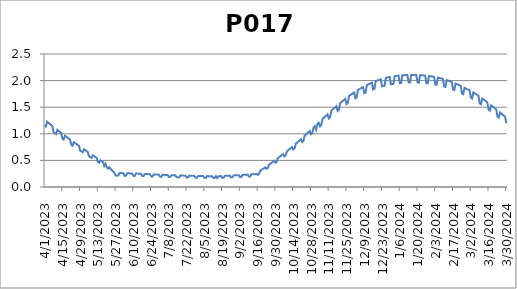
| Category | P017 |
|---|---|
| 4/1/23 | 1.159 |
| 4/2/23 | 1.139 |
| 4/3/23 | 1.226 |
| 4/4/23 | 1.207 |
| 4/5/23 | 1.187 |
| 4/6/23 | 1.168 |
| 4/7/23 | 1.149 |
| 4/8/23 | 1.031 |
| 4/9/23 | 1.013 |
| 4/10/23 | 0.995 |
| 4/11/23 | 1.075 |
| 4/12/23 | 1.056 |
| 4/13/23 | 1.037 |
| 4/14/23 | 1.019 |
| 4/15/23 | 0.909 |
| 4/16/23 | 0.891 |
| 4/17/23 | 0.964 |
| 4/18/23 | 0.947 |
| 4/19/23 | 0.929 |
| 4/20/23 | 0.911 |
| 4/21/23 | 0.894 |
| 4/22/23 | 0.794 |
| 4/23/23 | 0.778 |
| 4/24/23 | 0.842 |
| 4/25/23 | 0.825 |
| 4/26/23 | 0.808 |
| 4/27/23 | 0.792 |
| 4/28/23 | 0.775 |
| 4/29/23 | 0.684 |
| 4/30/23 | 0.669 |
| 5/1/23 | 0.652 |
| 5/2/23 | 0.709 |
| 5/3/23 | 0.693 |
| 5/4/23 | 0.677 |
| 5/5/23 | 0.66 |
| 5/6/23 | 0.577 |
| 5/7/23 | 0.561 |
| 5/8/23 | 0.546 |
| 5/9/23 | 0.596 |
| 5/10/23 | 0.579 |
| 5/11/23 | 0.563 |
| 5/12/23 | 0.548 |
| 5/13/23 | 0.472 |
| 5/14/23 | 0.457 |
| 5/15/23 | 0.5 |
| 5/16/23 | 0.484 |
| 5/17/23 | 0.468 |
| 5/18/23 | 0.397 |
| 5/19/23 | 0.436 |
| 5/20/23 | 0.367 |
| 5/21/23 | 0.346 |
| 5/22/23 | 0.37 |
| 5/23/23 | 0.343 |
| 5/24/23 | 0.316 |
| 5/25/23 | 0.29 |
| 5/26/23 | 0.269 |
| 5/27/23 | 0.215 |
| 5/28/23 | 0.214 |
| 5/29/23 | 0.214 |
| 5/30/23 | 0.263 |
| 5/31/23 | 0.262 |
| 6/1/23 | 0.261 |
| 6/2/23 | 0.26 |
| 6/3/23 | 0.212 |
| 6/4/23 | 0.211 |
| 6/5/23 | 0.258 |
| 6/6/23 | 0.257 |
| 6/7/23 | 0.256 |
| 6/8/23 | 0.255 |
| 6/9/23 | 0.255 |
| 6/10/23 | 0.209 |
| 6/11/23 | 0.209 |
| 6/12/23 | 0.252 |
| 6/13/23 | 0.252 |
| 6/14/23 | 0.251 |
| 6/15/23 | 0.25 |
| 6/16/23 | 0.249 |
| 6/17/23 | 0.206 |
| 6/18/23 | 0.205 |
| 6/19/23 | 0.245 |
| 6/20/23 | 0.244 |
| 6/21/23 | 0.243 |
| 6/22/23 | 0.242 |
| 6/23/23 | 0.24 |
| 6/24/23 | 0.199 |
| 6/25/23 | 0.198 |
| 6/26/23 | 0.237 |
| 6/27/23 | 0.236 |
| 6/28/23 | 0.235 |
| 6/29/23 | 0.233 |
| 6/30/23 | 0.232 |
| 7/1/23 | 0.193 |
| 7/2/23 | 0.193 |
| 7/3/23 | 0.229 |
| 7/4/23 | 0.228 |
| 7/5/23 | 0.227 |
| 7/6/23 | 0.226 |
| 7/7/23 | 0.225 |
| 7/8/23 | 0.188 |
| 7/9/23 | 0.187 |
| 7/10/23 | 0.222 |
| 7/11/23 | 0.221 |
| 7/12/23 | 0.22 |
| 7/13/23 | 0.219 |
| 7/14/23 | 0.183 |
| 7/15/23 | 0.182 |
| 7/16/23 | 0.182 |
| 7/17/23 | 0.216 |
| 7/18/23 | 0.215 |
| 7/19/23 | 0.214 |
| 7/20/23 | 0.214 |
| 7/21/23 | 0.213 |
| 7/22/23 | 0.179 |
| 7/23/23 | 0.178 |
| 7/24/23 | 0.211 |
| 7/25/23 | 0.211 |
| 7/26/23 | 0.21 |
| 7/27/23 | 0.209 |
| 7/28/23 | 0.209 |
| 7/29/23 | 0.175 |
| 7/30/23 | 0.174 |
| 7/31/23 | 0.207 |
| 8/1/23 | 0.207 |
| 8/2/23 | 0.207 |
| 8/3/23 | 0.206 |
| 8/4/23 | 0.206 |
| 8/5/23 | 0.172 |
| 8/6/23 | 0.172 |
| 8/7/23 | 0.204 |
| 8/8/23 | 0.204 |
| 8/9/23 | 0.204 |
| 8/10/23 | 0.203 |
| 8/11/23 | 0.203 |
| 8/12/23 | 0.169 |
| 8/13/23 | 0.169 |
| 8/14/23 | 0.202 |
| 8/15/23 | 0.168 |
| 8/16/23 | 0.203 |
| 8/17/23 | 0.204 |
| 8/18/23 | 0.205 |
| 8/19/23 | 0.173 |
| 8/20/23 | 0.174 |
| 8/21/23 | 0.209 |
| 8/22/23 | 0.21 |
| 8/23/23 | 0.212 |
| 8/24/23 | 0.213 |
| 8/25/23 | 0.214 |
| 8/26/23 | 0.181 |
| 8/27/23 | 0.182 |
| 8/28/23 | 0.218 |
| 8/29/23 | 0.22 |
| 8/30/23 | 0.221 |
| 8/31/23 | 0.222 |
| 9/1/23 | 0.223 |
| 9/2/23 | 0.188 |
| 9/3/23 | 0.189 |
| 9/4/23 | 0.227 |
| 9/5/23 | 0.228 |
| 9/6/23 | 0.23 |
| 9/7/23 | 0.231 |
| 9/8/23 | 0.233 |
| 9/9/23 | 0.197 |
| 9/10/23 | 0.198 |
| 9/11/23 | 0.237 |
| 9/12/23 | 0.239 |
| 9/13/23 | 0.24 |
| 9/14/23 | 0.242 |
| 9/15/23 | 0.246 |
| 9/16/23 | 0.228 |
| 9/17/23 | 0.246 |
| 9/18/23 | 0.305 |
| 9/19/23 | 0.325 |
| 9/20/23 | 0.338 |
| 9/21/23 | 0.352 |
| 9/22/23 | 0.368 |
| 9/23/23 | 0.342 |
| 9/24/23 | 0.359 |
| 9/25/23 | 0.421 |
| 9/26/23 | 0.44 |
| 9/27/23 | 0.456 |
| 9/28/23 | 0.475 |
| 9/29/23 | 0.492 |
| 9/30/23 | 0.458 |
| 10/1/23 | 0.476 |
| 10/2/23 | 0.545 |
| 10/3/23 | 0.563 |
| 10/4/23 | 0.58 |
| 10/5/23 | 0.598 |
| 10/6/23 | 0.617 |
| 10/7/23 | 0.576 |
| 10/8/23 | 0.593 |
| 10/9/23 | 0.671 |
| 10/10/23 | 0.689 |
| 10/11/23 | 0.71 |
| 10/12/23 | 0.729 |
| 10/13/23 | 0.75 |
| 10/14/23 | 0.706 |
| 10/15/23 | 0.725 |
| 10/16/23 | 0.813 |
| 10/17/23 | 0.834 |
| 10/18/23 | 0.856 |
| 10/19/23 | 0.877 |
| 10/20/23 | 0.898 |
| 10/21/23 | 0.845 |
| 10/22/23 | 0.866 |
| 10/23/23 | 0.964 |
| 10/24/23 | 0.986 |
| 10/25/23 | 1.008 |
| 10/26/23 | 1.029 |
| 10/27/23 | 1.052 |
| 10/28/23 | 0.991 |
| 10/29/23 | 1.013 |
| 10/30/23 | 1.119 |
| 10/31/23 | 1.142 |
| 11/1/23 | 1.077 |
| 11/2/23 | 1.187 |
| 11/3/23 | 1.21 |
| 11/4/23 | 1.14 |
| 11/5/23 | 1.163 |
| 11/6/23 | 1.276 |
| 11/7/23 | 1.299 |
| 11/8/23 | 1.322 |
| 11/9/23 | 1.344 |
| 11/10/23 | 1.367 |
| 11/11/23 | 1.288 |
| 11/12/23 | 1.309 |
| 11/13/23 | 1.432 |
| 11/14/23 | 1.453 |
| 11/15/23 | 1.475 |
| 11/16/23 | 1.496 |
| 11/17/23 | 1.517 |
| 11/18/23 | 1.43 |
| 11/19/23 | 1.449 |
| 11/20/23 | 1.579 |
| 11/21/23 | 1.598 |
| 11/22/23 | 1.618 |
| 11/23/23 | 1.637 |
| 11/24/23 | 1.656 |
| 11/25/23 | 1.558 |
| 11/26/23 | 1.575 |
| 11/27/23 | 1.71 |
| 11/28/23 | 1.728 |
| 11/29/23 | 1.744 |
| 11/30/23 | 1.76 |
| 12/1/23 | 1.777 |
| 12/2/23 | 1.669 |
| 12/3/23 | 1.684 |
| 12/4/23 | 1.824 |
| 12/5/23 | 1.838 |
| 12/6/23 | 1.851 |
| 12/7/23 | 1.865 |
| 12/8/23 | 1.879 |
| 12/9/23 | 1.761 |
| 12/10/23 | 1.773 |
| 12/11/23 | 1.916 |
| 12/12/23 | 1.928 |
| 12/13/23 | 1.939 |
| 12/14/23 | 1.95 |
| 12/15/23 | 1.962 |
| 12/16/23 | 1.834 |
| 12/17/23 | 1.845 |
| 12/18/23 | 1.99 |
| 12/19/23 | 1.999 |
| 12/20/23 | 2.006 |
| 12/21/23 | 2.016 |
| 12/22/23 | 2.024 |
| 12/23/23 | 1.892 |
| 12/24/23 | 1.898 |
| 12/25/23 | 1.904 |
| 12/26/23 | 2.051 |
| 12/27/23 | 2.057 |
| 12/28/23 | 2.063 |
| 12/29/23 | 2.068 |
| 12/30/23 | 1.931 |
| 12/31/23 | 1.934 |
| 1/1/24 | 1.938 |
| 1/2/24 | 2.084 |
| 1/3/24 | 2.088 |
| 1/4/24 | 2.091 |
| 1/5/24 | 2.094 |
| 1/6/24 | 1.953 |
| 1/7/24 | 1.956 |
| 1/8/24 | 2.1 |
| 1/9/24 | 2.101 |
| 1/10/24 | 2.103 |
| 1/11/24 | 2.104 |
| 1/12/24 | 2.105 |
| 1/13/24 | 1.963 |
| 1/14/24 | 1.964 |
| 1/15/24 | 2.107 |
| 1/16/24 | 2.107 |
| 1/17/24 | 2.106 |
| 1/18/24 | 2.106 |
| 1/19/24 | 2.105 |
| 1/20/24 | 1.962 |
| 1/21/24 | 1.962 |
| 1/22/24 | 2.102 |
| 1/23/24 | 2.1 |
| 1/24/24 | 2.098 |
| 1/25/24 | 2.096 |
| 1/26/24 | 2.094 |
| 1/27/24 | 1.951 |
| 1/28/24 | 1.949 |
| 1/29/24 | 2.085 |
| 1/30/24 | 2.082 |
| 1/31/24 | 2.079 |
| 2/1/24 | 2.074 |
| 2/2/24 | 2.069 |
| 2/3/24 | 1.926 |
| 2/4/24 | 1.922 |
| 2/5/24 | 2.055 |
| 2/6/24 | 2.05 |
| 2/7/24 | 2.044 |
| 2/8/24 | 2.038 |
| 2/9/24 | 2.031 |
| 2/10/24 | 1.887 |
| 2/11/24 | 1.881 |
| 2/12/24 | 2.009 |
| 2/13/24 | 2.001 |
| 2/14/24 | 1.993 |
| 2/15/24 | 1.985 |
| 2/16/24 | 1.975 |
| 2/17/24 | 1.831 |
| 2/18/24 | 1.822 |
| 2/19/24 | 1.945 |
| 2/20/24 | 1.935 |
| 2/21/24 | 1.925 |
| 2/22/24 | 1.913 |
| 2/23/24 | 1.9 |
| 2/24/24 | 1.756 |
| 2/25/24 | 1.745 |
| 2/26/24 | 1.864 |
| 2/27/24 | 1.851 |
| 2/28/24 | 1.837 |
| 2/29/24 | 1.829 |
| 3/1/24 | 1.822 |
| 3/2/24 | 1.68 |
| 3/3/24 | 1.664 |
| 3/4/24 | 1.778 |
| 3/5/24 | 1.762 |
| 3/6/24 | 1.747 |
| 3/7/24 | 1.73 |
| 3/8/24 | 1.714 |
| 3/9/24 | 1.572 |
| 3/10/24 | 1.556 |
| 3/11/24 | 1.663 |
| 3/12/24 | 1.647 |
| 3/13/24 | 1.628 |
| 3/14/24 | 1.61 |
| 3/15/24 | 1.591 |
| 3/16/24 | 1.453 |
| 3/17/24 | 1.435 |
| 3/18/24 | 1.535 |
| 3/19/24 | 1.516 |
| 3/20/24 | 1.498 |
| 3/21/24 | 1.478 |
| 3/22/24 | 1.459 |
| 3/23/24 | 1.325 |
| 3/24/24 | 1.306 |
| 3/25/24 | 1.4 |
| 3/26/24 | 1.38 |
| 3/27/24 | 1.361 |
| 3/28/24 | 1.342 |
| 3/29/24 | 1.322 |
| 3/30/24 | 1.195 |